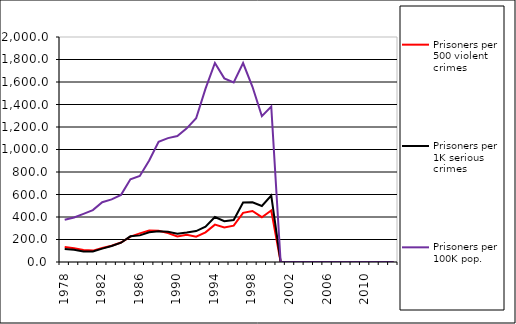
| Category | Prisoners per 500 violent crimes | Prisoners per 1K serious crimes | Prisoners per 100K pop. |
|---|---|---|---|
| 1978.0 | 132.948 | 114.937 | 375.371 |
| 1979.0 | 123.14 | 108.269 | 396.189 |
| 1980.0 | 106.444 | 93.655 | 428.032 |
| 1981.0 | 101.327 | 93.674 | 461.006 |
| 1982.0 | 125.065 | 118.952 | 531.062 |
| 1983.0 | 145.186 | 141.915 | 556.18 |
| 1984.0 | 173.333 | 171.502 | 596.79 |
| 1985.0 | 226.33 | 228.192 | 735.463 |
| 1986.0 | 254.006 | 236.535 | 764.696 |
| 1987.0 | 280.252 | 264.064 | 902.572 |
| 1988.0 | 278.16 | 273.726 | 1069.032 |
| 1989.0 | 257.015 | 269.046 | 1100.993 |
| 1990.0 | 227.83 | 252.207 | 1120.119 |
| 1991.0 | 242.178 | 262.446 | 1188.294 |
| 1992.0 | 225.592 | 274.684 | 1278.098 |
| 1993.0 | 263.738 | 313.419 | 1541.176 |
| 1994.0 | 332.246 | 399.976 | 1769.298 |
| 1995.0 | 306.633 | 362.71 | 1632.13 |
| 1996.0 | 323.168 | 372.994 | 1596.317 |
| 1997.0 | 436.73 | 529.285 | 1768.053 |
| 1998.0 | 453.049 | 530.588 | 1557.17 |
| 1999.0 | 398.319 | 497.965 | 1296.724 |
| 2000.0 | 458.15 | 591.13 | 1381.676 |
| 2001.0 | 0 | 0 | 0 |
| 2002.0 | 0 | 0 | 0 |
| 2003.0 | 0 | 0 | 0 |
| 2004.0 | 0 | 0 | 0 |
| 2005.0 | 0 | 0 | 0 |
| 2006.0 | 0 | 0 | 0 |
| 2007.0 | 0 | 0 | 0 |
| 2008.0 | 0 | 0 | 0 |
| 2009.0 | 0 | 0 | 0 |
| 2010.0 | 0 | 0 | 0 |
| 2011.0 | 0 | 0 | 0 |
| 2012.0 | 0 | 0 | 0 |
| 2013.0 | 0 | 0 | 0 |